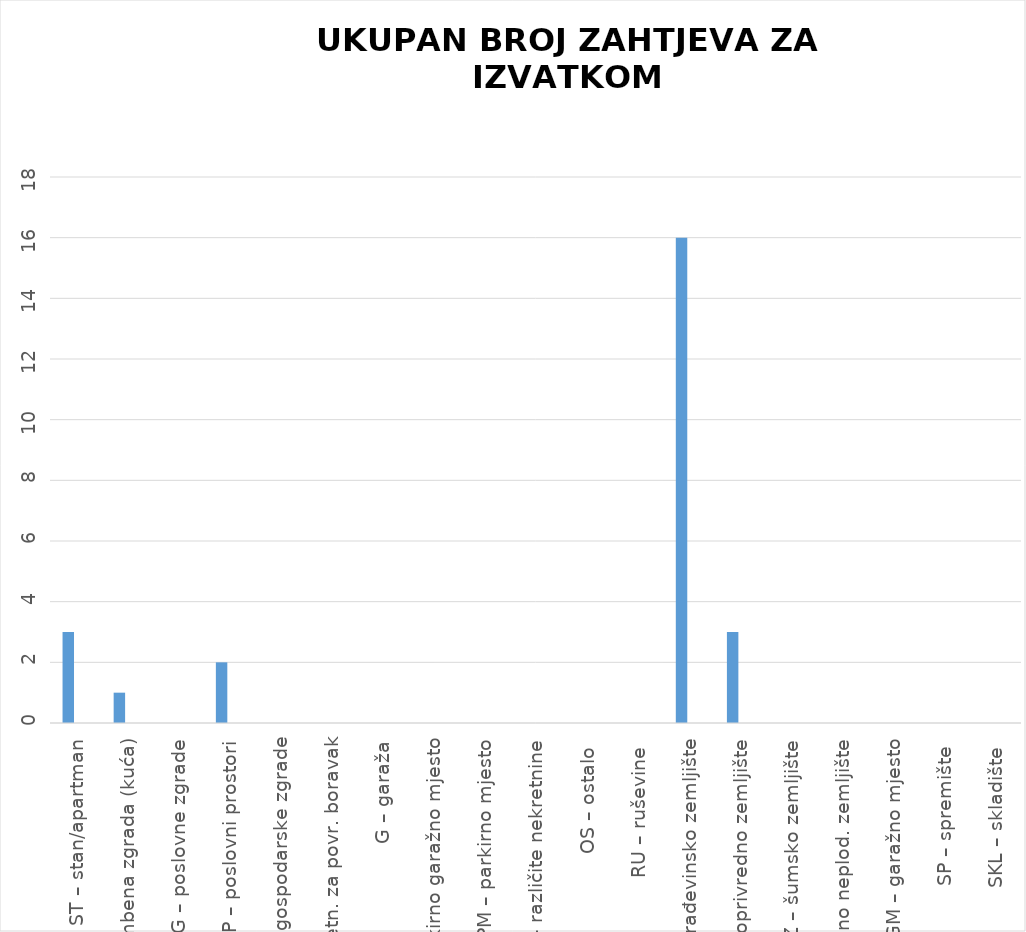
| Category | BROJ ZAPRIMLJENIH ZAHTJEVA KROZ APLIKACIJU eNekretnine | BROJ ZAPRIMLJENIH ZAHTJEVA IZVAN APLIKACIJE
(Popunjava službenik) |
|---|---|---|
| ST – stan/apartman | 3 | 0 |
| OK – stambena zgrada (kuća) | 1 | 0 |
| PZG – poslovne zgrade | 0 | 0 |
| PP – poslovni prostori | 2 | 0 |
| GZG – gospodarske zgrade | 0 | 0 |
| VIK – nekretn. za povr. boravak | 0 | 0 |
| G – garaža | 0 | 0 |
| PGM – parkirno garažno mjesto | 0 | 0 |
| VPM – parkirno mjesto | 0 | 0 |
| RN – različite nekretnine | 0 | 0 |
| OS – ostalo  | 0 | 0 |
| RU – ruševine  | 0 | 0 |
| GZ – građevinsko zemljište | 16 | 0 |
| PZ – poljoprivredno zemljište | 3 | 0 |
| ŠZ – šumsko zemljište | 0 | 0 |
| PNZ – prirodno neplod. zemljište | 0 | 0 |
| GM – garažno mjesto | 0 | 0 |
| SP – spremište  | 0 | 0 |
| SKL – skladište  | 0 | 0 |